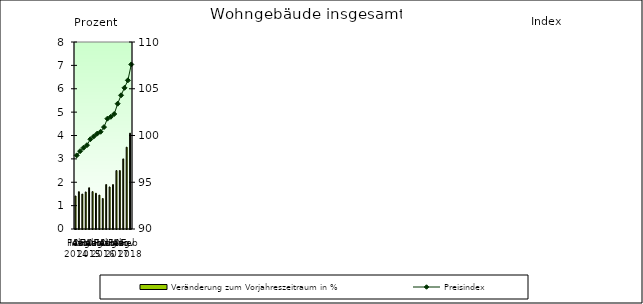
| Category | Veränderung zum Vorjahreszeitraum in % |
|---|---|
| 0 | 1.412 |
| 1 | 1.596 |
| 2 | 1.495 |
| 3 | 1.586 |
| 4 | 1.764 |
| 5 | 1.599 |
| 6 | 1.529 |
| 7 | 1.451 |
| 8 | 1.305 |
| 9 | 1.902 |
| 10 | 1.8 |
| 11 | 1.9 |
| 12 | 2.5 |
| 13 | 2.5 |
| 14 | 3 |
| 15 | 3.5 |
| 16 | 4.1 |